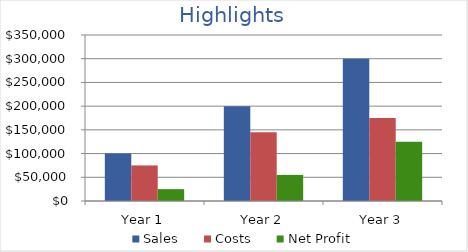
| Category | Sales | Costs | Net Profit |
|---|---|---|---|
| Year 1 | 100000 | 75000 | 25000 |
| Year 2 | 200000 | 145000 | 55000 |
| Year 3 | 300000 | 175000 | 125000 |